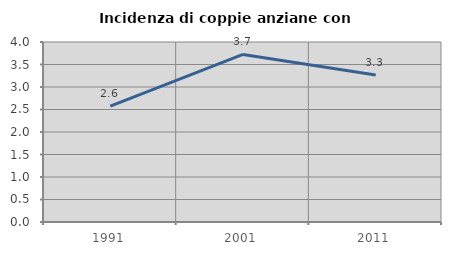
| Category | Incidenza di coppie anziane con figli |
|---|---|
| 1991.0 | 2.577 |
| 2001.0 | 3.724 |
| 2011.0 | 3.268 |